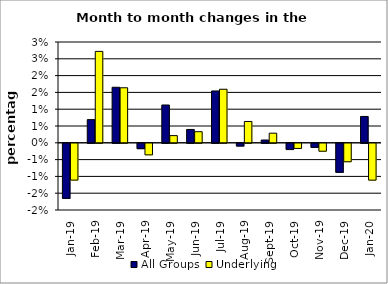
| Category | All Groups | Underlying |
|---|---|---|
| 2019-01-01 | -0.016 | -0.011 |
| 2019-02-01 | 0.007 | 0.027 |
| 2019-03-01 | 0.017 | 0.016 |
| 2019-04-01 | -0.002 | -0.003 |
| 2019-05-01 | 0.011 | 0.002 |
| 2019-06-01 | 0.004 | 0.003 |
| 2019-07-01 | 0.015 | 0.016 |
| 2019-08-01 | -0.001 | 0.006 |
| 2019-09-01 | 0.001 | 0.003 |
| 2019-10-01 | -0.002 | -0.002 |
| 2019-11-01 | -0.001 | -0.002 |
| 2019-12-01 | -0.009 | -0.005 |
| 2020-01-01 | 0.008 | -0.011 |